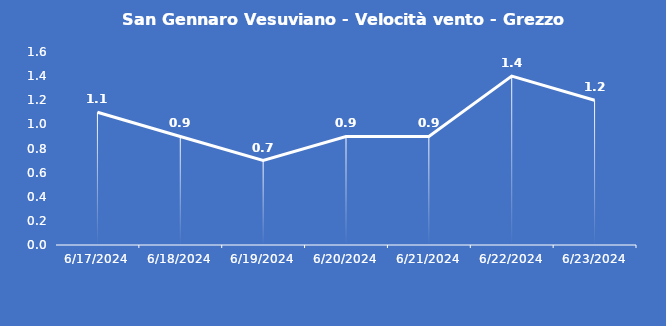
| Category | San Gennaro Vesuviano - Velocità vento - Grezzo (m/s) |
|---|---|
| 6/17/24 | 1.1 |
| 6/18/24 | 0.9 |
| 6/19/24 | 0.7 |
| 6/20/24 | 0.9 |
| 6/21/24 | 0.9 |
| 6/22/24 | 1.4 |
| 6/23/24 | 1.2 |